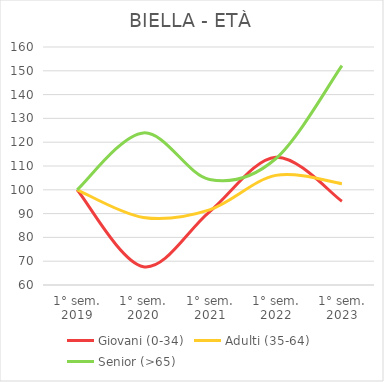
| Category | Giovani (0-34) | Adulti (35-64) | Senior (>65) |
|---|---|---|---|
| 1° sem.
2019 | 100 | 100 | 100 |
| 1° sem.
2020 | 67.702 | 88.399 | 123.913 |
| 1° sem.
2021 | 90.74 | 91.583 | 104.348 |
| 1° sem.
2022 | 113.665 | 106.062 | 113.043 |
| 1° sem.
2023 | 95.2 | 102.573 | 152.174 |